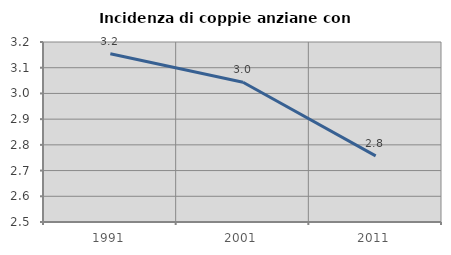
| Category | Incidenza di coppie anziane con figli |
|---|---|
| 1991.0 | 3.155 |
| 2001.0 | 3.043 |
| 2011.0 | 2.757 |